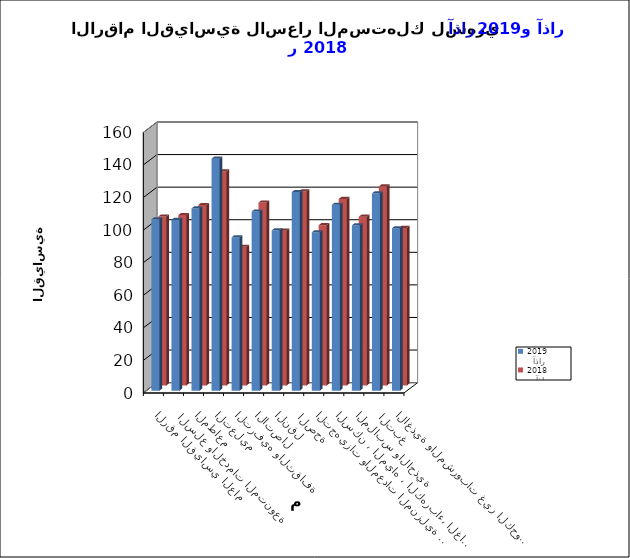
| Category |   آذار     2019      |    آذار      2018 |
|---|---|---|
| الاغذية والمشروبات غير الكحولية | 99.7 | 96.7 |
|  التبغ | 121.1 | 122.2 |
| الملابس والاحذية | 101.5 | 103.6 |
| السكن ، المياه ، الكهرباء، الغاز  | 114.1 | 114.5 |
| التجهيزات والمعدات المنزلية والصيانة | 97.2 | 98.4 |
|  الصحة | 121.9 | 119.1 |
| النقل | 98.4 | 95 |
| الاتصال | 110 | 112.3 |
| الترفيه والثقافة | 94.1 | 85.1 |
| التعليم | 142.4 | 131.4 |
| المطاعم  | 111.9 | 110.8 |
|  السلع والخدمات المتنوعة | 104.9 | 104.6 |
| الرقم القياسي العام | 105.2 | 103.7 |